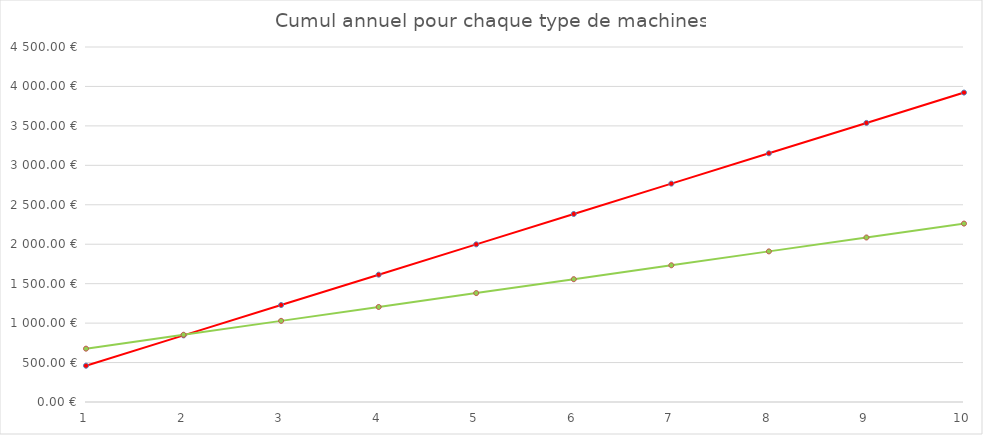
| Category | Cumul capsule | Cumul grain |
|---|---|---|
| 0 | 459.72 | 676.154 |
| 1 | 844.44 | 852.308 |
| 2 | 1229.16 | 1028.462 |
| 3 | 1613.88 | 1204.615 |
| 4 | 1998.6 | 1380.769 |
| 5 | 2383.32 | 1556.923 |
| 6 | 2768.04 | 1733.077 |
| 7 | 3152.76 | 1909.231 |
| 8 | 3537.48 | 2085.385 |
| 9 | 3922.2 | 2261.538 |